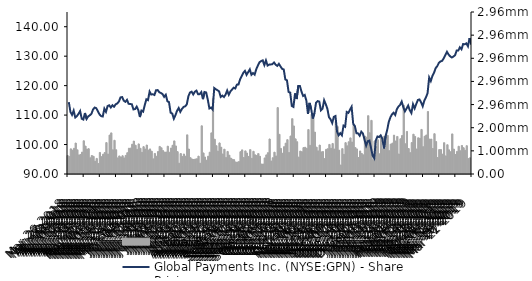
| Category | Global Payments Inc. (NYSE:GPN) - Volume |
|---|---|
| 2018-03-26 | 799937 |
| 2018-03-27 | 756993 |
| 2018-03-28 | 1086883 |
| 2018-03-29 | 1029270 |
| 2018-04-02 | 1110332 |
| 2018-04-03 | 1338779 |
| 2018-04-04 | 1045786 |
| 2018-04-05 | 824160 |
| 2018-04-06 | 844764 |
| 2018-04-09 | 946783 |
| 2018-04-10 | 1434853 |
| 2018-04-11 | 1208095 |
| 2018-04-12 | 1076936 |
| 2018-04-13 | 1095980 |
| 2018-04-16 | 702160 |
| 2018-04-17 | 797609 |
| 2018-04-18 | 765055 |
| 2018-04-19 | 554320 |
| 2018-04-20 | 673295 |
| 2018-04-23 | 453536 |
| 2018-04-24 | 930728 |
| 2018-04-25 | 746558 |
| 2018-04-26 | 853449 |
| 2018-04-27 | 925347 |
| 2018-04-30 | 1357903 |
| 2018-05-01 | 863259 |
| 2018-05-02 | 1680837 |
| 2018-05-03 | 1776844 |
| 2018-05-04 | 1042665 |
| 2018-05-07 | 1457289 |
| 2018-05-08 | 1048771 |
| 2018-05-09 | 695228 |
| 2018-05-10 | 780604 |
| 2018-05-11 | 732071 |
| 2018-05-14 | 788670 |
| 2018-05-15 | 694300 |
| 2018-05-16 | 802898 |
| 2018-05-17 | 919496 |
| 2018-05-18 | 1113697 |
| 2018-05-21 | 1117422 |
| 2018-05-22 | 1287305 |
| 2018-05-23 | 1422604 |
| 2018-05-24 | 1243059 |
| 2018-05-25 | 1065097 |
| 2018-05-29 | 1301334 |
| 2018-05-30 | 1111369 |
| 2018-05-31 | 936373 |
| 2018-06-01 | 1182603 |
| 2018-06-04 | 1079491 |
| 2018-06-05 | 1252783 |
| 2018-06-06 | 1032939 |
| 2018-06-07 | 1083197 |
| 2018-06-08 | 988322 |
| 2018-06-11 | 655305 |
| 2018-06-12 | 887926 |
| 2018-06-13 | 765982 |
| 2018-06-14 | 971494 |
| 2018-06-15 | 1191726 |
| 2018-06-18 | 1133594 |
| 2018-06-19 | 1010972 |
| 2018-06-20 | 946935 |
| 2018-06-21 | 951600 |
| 2018-06-22 | 1202087 |
| 2018-06-25 | 938491 |
| 2018-06-26 | 1120085 |
| 2018-06-27 | 1241309 |
| 2018-06-28 | 1430592 |
| 2018-06-29 | 1213479 |
| 2018-07-02 | 967052 |
| 2018-07-03 | 466986 |
| 2018-07-05 | 882502 |
| 2018-07-06 | 757655 |
| 2018-07-09 | 864504 |
| 2018-07-10 | 768467 |
| 2018-07-11 | 1692476 |
| 2018-07-12 | 1079782 |
| 2018-07-13 | 704675 |
| 2018-07-16 | 648819 |
| 2018-07-17 | 626773 |
| 2018-07-18 | 647131 |
| 2018-07-19 | 659101 |
| 2018-07-20 | 771931 |
| 2018-07-23 | 467479 |
| 2018-07-24 | 2082230 |
| 2018-07-25 | 910691 |
| 2018-07-26 | 735206 |
| 2018-07-27 | 594578 |
| 2018-07-30 | 768902 |
| 2018-07-31 | 941462 |
| 2018-08-01 | 1776497 |
| 2018-08-02 | 3271533 |
| 2018-08-03 | 1503221 |
| 2018-08-06 | 1225146 |
| 2018-08-07 | 989983 |
| 2018-08-08 | 1343293 |
| 2018-08-09 | 1159536 |
| 2018-08-10 | 864360 |
| 2018-08-13 | 1072494 |
| 2018-08-14 | 713808 |
| 2018-08-15 | 974538 |
| 2018-08-16 | 815450 |
| 2018-08-17 | 688690 |
| 2018-08-20 | 637003 |
| 2018-08-21 | 621788 |
| 2018-08-22 | 520529 |
| 2018-08-23 | 512783 |
| 2018-08-24 | 534886 |
| 2018-08-27 | 962260 |
| 2018-08-28 | 1042943 |
| 2018-08-29 | 709771 |
| 2018-08-30 | 999097 |
| 2018-08-31 | 907319 |
| 2018-09-04 | 758570 |
| 2018-09-05 | 1053173 |
| 2018-09-06 | 675585 |
| 2018-09-07 | 981057 |
| 2018-09-10 | 831553 |
| 2018-09-11 | 794499 |
| 2018-09-12 | 882709 |
| 2018-09-13 | 765944 |
| 2018-09-14 | 429182 |
| 2018-09-17 | 433068 |
| 2018-09-18 | 693306 |
| 2018-09-19 | 825219 |
| 2018-09-20 | 922815 |
| 2018-09-21 | 1514120 |
| 2018-09-24 | 562425 |
| 2018-09-25 | 702275 |
| 2018-09-26 | 943797 |
| 2018-09-27 | 780176 |
| 2018-09-28 | 2869878 |
| 2018-10-01 | 1714854 |
| 2018-10-02 | 1106204 |
| 2018-10-03 | 894795 |
| 2018-10-04 | 1180933 |
| 2018-10-05 | 1331696 |
| 2018-10-08 | 1483771 |
| 2018-10-09 | 928339 |
| 2018-10-10 | 1639953 |
| 2018-10-11 | 2391291 |
| 2018-10-12 | 2077699 |
| 2018-10-15 | 1518247 |
| 2018-10-16 | 1395990 |
| 2018-10-17 | 728728 |
| 2018-10-18 | 990639 |
| 2018-10-19 | 962682 |
| 2018-10-22 | 1140206 |
| 2018-10-23 | 1154545 |
| 2018-10-24 | 1103555 |
| 2018-10-25 | 1919148 |
| 2018-10-26 | 1238236 |
| 2018-10-29 | 2580694 |
| 2018-10-30 | 2416044 |
| 2018-10-31 | 1811043 |
| 2018-11-01 | 1160244 |
| 2018-11-02 | 999601 |
| 2018-11-05 | 1250045 |
| 2018-11-06 | 954947 |
| 2018-11-07 | 968677 |
| 2018-11-08 | 662011 |
| 2018-11-09 | 1063988 |
| 2018-11-12 | 1091748 |
| 2018-11-13 | 1278081 |
| 2018-11-14 | 1112297 |
| 2018-11-15 | 1319608 |
| 2018-11-16 | 1080210 |
| 2018-11-19 | 2276711 |
| 2018-11-20 | 2052161 |
| 2018-11-21 | 1030754 |
| 2018-11-23 | 387261 |
| 2018-11-26 | 1096044 |
| 2018-11-27 | 850780 |
| 2018-11-28 | 1355296 |
| 2018-11-29 | 1218279 |
| 2018-11-30 | 1391521 |
| 2018-12-03 | 1560574 |
| 2018-12-04 | 1382773 |
| 2018-12-06 | 2120130 |
| 2018-12-07 | 1143965 |
| 2018-12-10 | 1085100 |
| 2018-12-11 | 712432 |
| 2018-12-12 | 995265 |
| 2018-12-13 | 887397 |
| 2018-12-14 | 828196 |
| 2018-12-17 | 1637983 |
| 2018-12-18 | 1589020 |
| 2018-12-19 | 2519350 |
| 2018-12-20 | 1781265 |
| 2018-12-21 | 2318182 |
| 2018-12-24 | 619773 |
| 2018-12-26 | 1419544 |
| 2018-12-27 | 1192560 |
| 2018-12-28 | 1476405 |
| 2018-12-31 | 870284 |
| 2019-01-02 | 1569940 |
| 2019-01-03 | 1086248 |
| 2019-01-04 | 1629939 |
| 2019-01-07 | 1728252 |
| 2019-01-08 | 1670235 |
| 2019-01-09 | 1010568 |
| 2019-01-10 | 1291162 |
| 2019-01-11 | 1334461 |
| 2019-01-14 | 1677989 |
| 2019-01-15 | 1423973 |
| 2019-01-16 | 1623058 |
| 2019-01-17 | 864650 |
| 2019-01-18 | 1521194 |
| 2019-01-22 | 1662991 |
| 2019-01-23 | 2972762 |
| 2019-01-24 | 1305751 |
| 2019-01-25 | 1837474 |
| 2019-01-28 | 1101658 |
| 2019-01-29 | 923113 |
| 2019-01-30 | 1358416 |
| 2019-01-31 | 1719613 |
| 2019-02-01 | 1623660 |
| 2019-02-04 | 1079088 |
| 2019-02-05 | 1565498 |
| 2019-02-06 | 1541264 |
| 2019-02-07 | 1925920 |
| 2019-02-08 | 1181104 |
| 2019-02-11 | 1631657 |
| 2019-02-12 | 1685740 |
| 2019-02-13 | 2699444 |
| 2019-02-14 | 1507136 |
| 2019-02-15 | 1510225 |
| 2019-02-19 | 1102330 |
| 2019-02-20 | 1741452 |
| 2019-02-21 | 1403057 |
| 2019-02-22 | 710066 |
| 2019-02-25 | 1056599 |
| 2019-02-26 | 1054780 |
| 2019-02-27 | 855579 |
| 2019-02-28 | 1352565 |
| 2019-03-01 | 782307 |
| 2019-03-04 | 1265088 |
| 2019-03-05 | 1043555 |
| 2019-03-06 | 959211 |
| 2019-03-07 | 1732188 |
| 2019-03-08 | 1078518 |
| 2019-03-11 | 843422 |
| 2019-03-12 | 973915 |
| 2019-03-13 | 1198734 |
| 2019-03-14 | 1005157 |
| 2019-03-15 | 1232087 |
| 2019-03-18 | 1134445 |
| 2019-03-19 | 1025939 |
| 2019-03-20 | 1224309 |
| 2019-03-21 | 665638 |
| 2019-03-22 | 699450 |